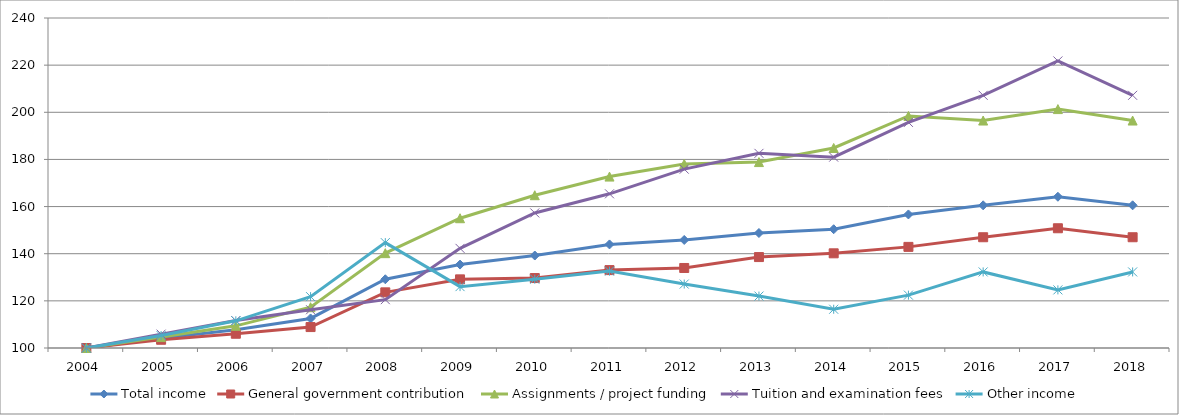
| Category | Total income | General government contribution | Assignments / project funding | Tuition and examination fees | Other income  |
|---|---|---|---|---|---|
| 2004.0 | 100 | 100 | 100 | 100 | 100 |
| 2005.0 | 104.092 | 103.499 | 104.629 | 105.881 | 105.274 |
| 2006.0 | 107.725 | 106.046 | 109.4 | 111.65 | 111.532 |
| 2007.0 | 112.54 | 108.881 | 117.297 | 116.238 | 121.792 |
| 2008.0 | 129.159 | 123.607 | 140.241 | 120.507 | 144.7 |
| 2009.0 | 135.394 | 129.117 | 155.052 | 142.268 | 126.04 |
| 2010.0 | 139.236 | 129.673 | 164.812 | 157.305 | 129.194 |
| 2011.0 | 143.936 | 133.048 | 172.718 | 165.412 | 132.613 |
| 2012.0 | 145.837 | 133.95 | 178.088 | 175.878 | 127.131 |
| 2013.0 | 148.786 | 138.576 | 178.882 | 182.576 | 122.028 |
| 2014.0 | 150.389 | 140.17 | 184.857 | 180.975 | 116.442 |
| 2015.0 | 156.657 | 142.9 | 198.435 | 195.707 | 122.426 |
| 2016.0 | 160.529 | 146.987 | 196.5 | 207.207 | 132.276 |
| 2017.0 | 164.164 | 150.797 | 201.356 | 221.776 | 124.656 |
| 2018.0 | 160.529 | 146.987 | 196.5 | 207.207 | 132.276 |